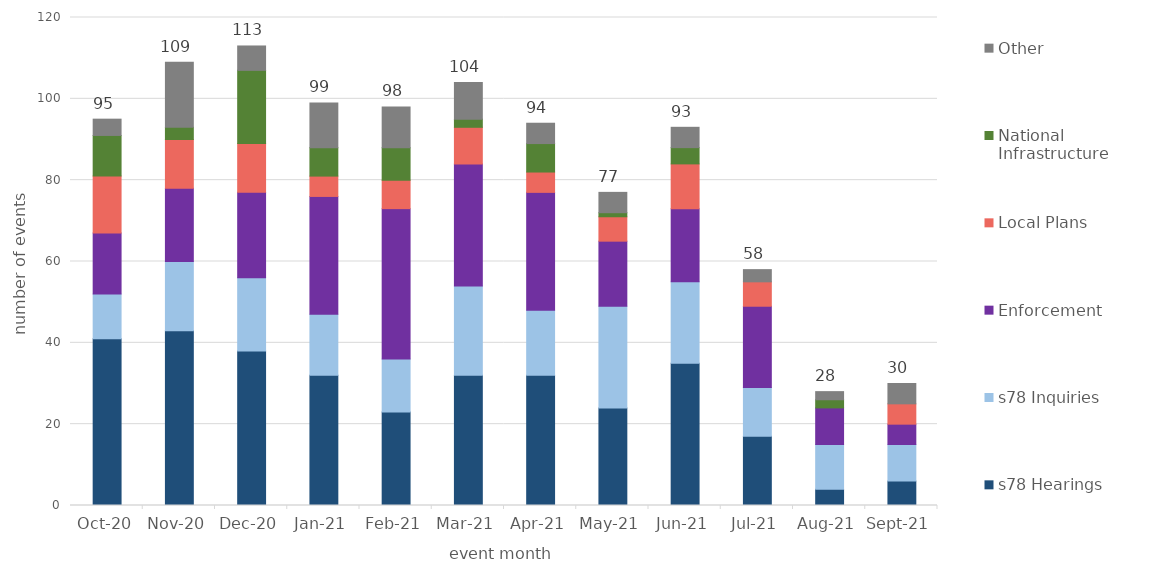
| Category | s78 Hearings | s78 Inquiries | Enforcement | Local Plans | National Infrastructure | Other |
|---|---|---|---|---|---|---|
| 2020-10-01 | 41 | 11 | 15 | 14 | 10 | 4 |
| 2020-11-01 | 43 | 17 | 18 | 12 | 3 | 16 |
| 2020-12-01 | 38 | 18 | 21 | 12 | 18 | 6 |
| 2021-01-01 | 32 | 15 | 29 | 5 | 7 | 11 |
| 2021-02-01 | 23 | 13 | 37 | 7 | 8 | 10 |
| 2021-03-01 | 32 | 22 | 30 | 9 | 2 | 9 |
| 2021-04-01 | 32 | 16 | 29 | 5 | 7 | 5 |
| 2021-05-01 | 24 | 25 | 16 | 6 | 1 | 5 |
| 2021-06-01 | 35 | 20 | 18 | 11 | 4 | 5 |
| 2021-07-01 | 17 | 12 | 20 | 6 | 0 | 3 |
| 2021-08-01 | 4 | 11 | 9 | 0 | 2 | 2 |
| 2021-09-01 | 6 | 9 | 5 | 5 | 0 | 5 |